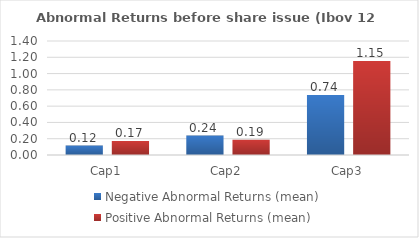
| Category | Negative Abnormal Returns (mean) | Positive Abnormal Returns (mean) |
|---|---|---|
| Cap1 | 0.116 | 0.171 |
| Cap2 | 0.239 | 0.187 |
| Cap3 | 0.738 | 1.153 |